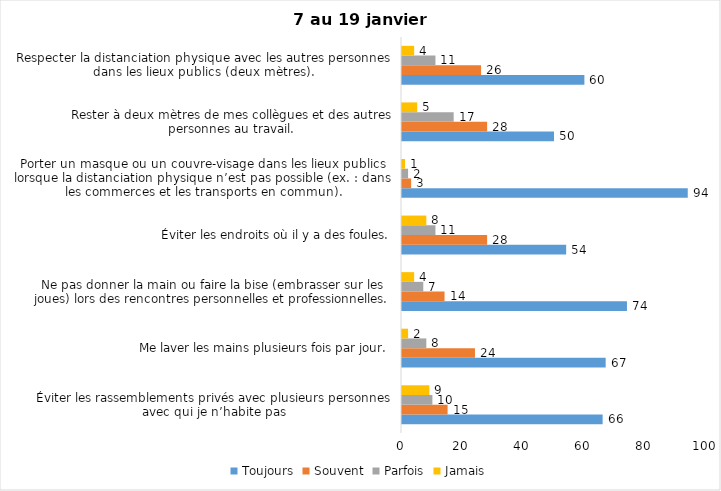
| Category | Toujours | Souvent | Parfois | Jamais |
|---|---|---|---|---|
| Éviter les rassemblements privés avec plusieurs personnes avec qui je n’habite pas | 66 | 15 | 10 | 9 |
| Me laver les mains plusieurs fois par jour. | 67 | 24 | 8 | 2 |
| Ne pas donner la main ou faire la bise (embrasser sur les joues) lors des rencontres personnelles et professionnelles. | 74 | 14 | 7 | 4 |
| Éviter les endroits où il y a des foules. | 54 | 28 | 11 | 8 |
| Porter un masque ou un couvre-visage dans les lieux publics lorsque la distanciation physique n’est pas possible (ex. : dans les commerces et les transports en commun). | 94 | 3 | 2 | 1 |
| Rester à deux mètres de mes collègues et des autres personnes au travail. | 50 | 28 | 17 | 5 |
| Respecter la distanciation physique avec les autres personnes dans les lieux publics (deux mètres). | 60 | 26 | 11 | 4 |